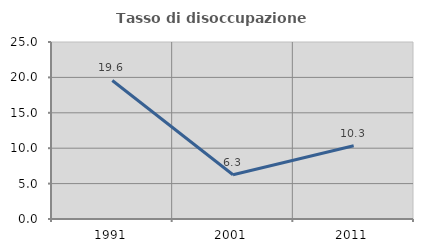
| Category | Tasso di disoccupazione giovanile  |
|---|---|
| 1991.0 | 19.565 |
| 2001.0 | 6.25 |
| 2011.0 | 10.345 |